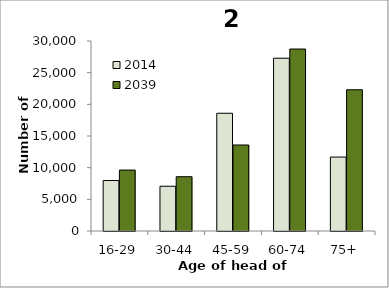
| Category | 2014 | 2039 |
|---|---|---|
| 16-29 | 7969 | 9621 |
| 30-44 | 7067 | 8573 |
| 45-59 | 18591 | 13581 |
| 60-74 | 27279 | 28731 |
| 75+ | 11676 | 22302 |